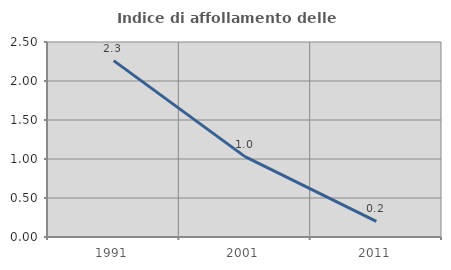
| Category | Indice di affollamento delle abitazioni  |
|---|---|
| 1991.0 | 2.261 |
| 2001.0 | 1.031 |
| 2011.0 | 0.201 |